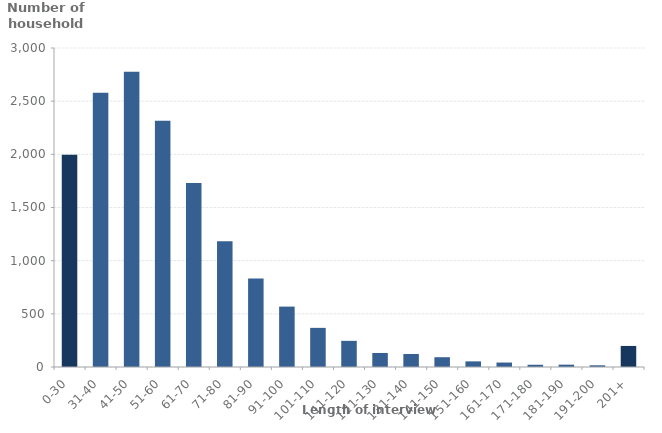
| Category | Frequency |
|---|---|
| 0-30 | 1997 |
| 31-40 | 2578 |
| 41-50 | 2777 |
| 51-60 | 2316 |
| 61-70 | 1730 |
| 71-80 | 1183 |
| 81-90 | 833 |
| 91-100 | 568 |
| 101-110 | 368 |
| 111-120 | 246 |
| 121-130 | 132 |
| 131-140 | 122 |
| 141-150 | 92 |
| 151-160 | 53 |
| 161-170 | 42 |
| 171-180 | 21 |
| 181-190 | 22 |
| 191-200 | 16 |
| 201+ | 198 |